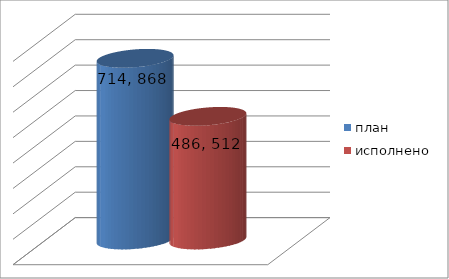
| Category | план | исполнено |
|---|---|---|
| 0 | 714868875.66 | 486512806.48 |